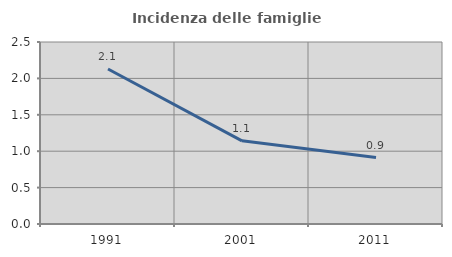
| Category | Incidenza delle famiglie numerose |
|---|---|
| 1991.0 | 2.129 |
| 2001.0 | 1.143 |
| 2011.0 | 0.913 |